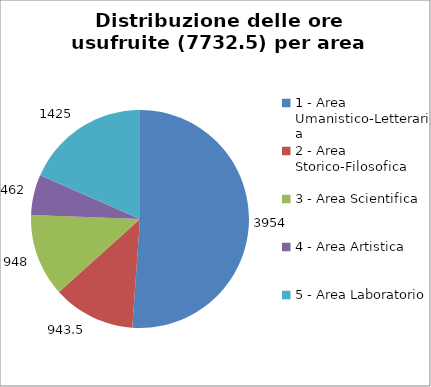
| Category | Nr. Ore Usufruite |
|---|---|
| 1 - Area Umanistico-Letteraria | 3954 |
| 2 - Area Storico-Filosofica | 943.5 |
| 3 - Area Scientifica | 948 |
| 4 - Area Artistica | 462 |
| 5 - Area Laboratorio | 1425 |